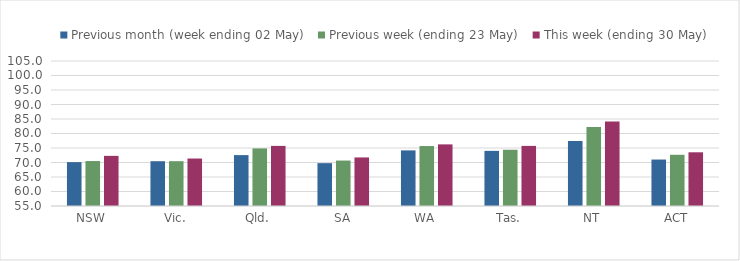
| Category | Previous month (week ending 02 May) | Previous week (ending 23 May) | This week (ending 30 May) |
|---|---|---|---|
| NSW | 70.133 | 70.5 | 72.288 |
| Vic. | 70.445 | 70.456 | 71.371 |
| Qld. | 72.546 | 74.86 | 75.726 |
| SA | 69.775 | 70.668 | 71.746 |
| WA | 74.176 | 75.676 | 76.247 |
| Tas. | 74.01 | 74.394 | 75.722 |
| NT | 77.387 | 82.282 | 84.112 |
| ACT | 71.022 | 72.662 | 73.519 |